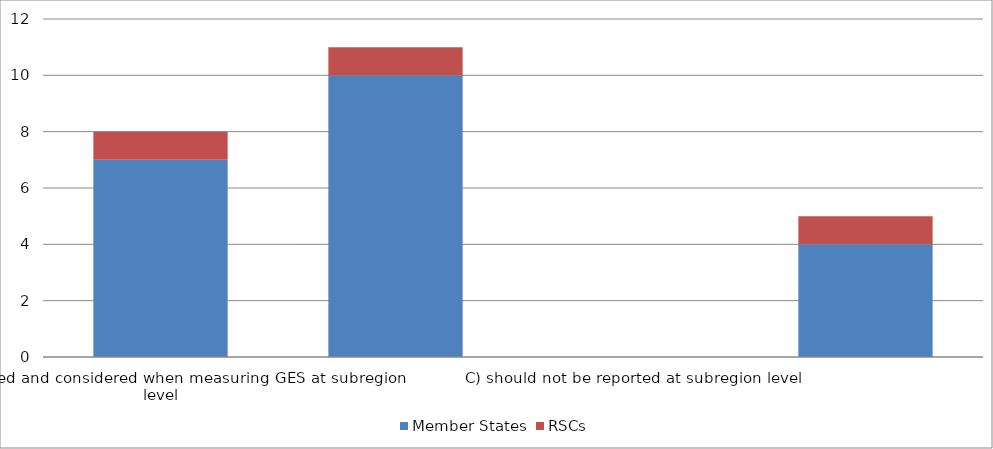
| Category | Member States | RSCs |
|---|---|---|
| A) reported and considered when measuring GES at subregion level | 7 | 1 |
| B) reported but not considered when measuring GES at subregion level, flagged with high uncertainty | 10 | 1 |
| C) should not be reported at subregion level | 0 | 0 |
| D) other  | 4 | 1 |